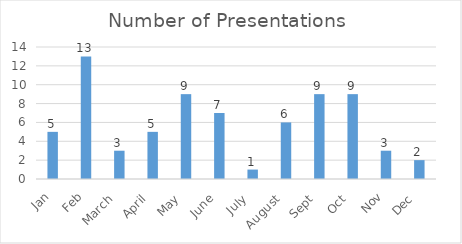
| Category | Number of Presentations  |
|---|---|
| Jan | 5 |
| Feb | 13 |
| March  | 3 |
| April  | 5 |
| May  | 9 |
| June  | 7 |
| July  | 1 |
| August  | 6 |
| Sept  | 9 |
| Oct  | 9 |
| Nov | 3 |
| Dec  | 2 |